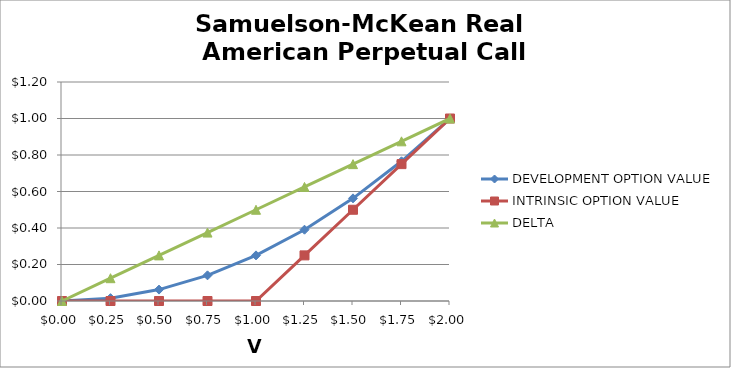
| Category | DEVELOPMENT OPTION VALUE | INTRINSIC OPTION VALUE | DELTA |
|---|---|---|---|
| 0.0 | 0 | 0 | 0 |
| 0.25 | 0.016 | 0 | 0.125 |
| 0.5 | 0.062 | 0 | 0.25 |
| 0.75 | 0.141 | 0 | 0.375 |
| 1.0 | 0.25 | 0 | 0.5 |
| 1.25 | 0.391 | 0.25 | 0.625 |
| 1.5 | 0.562 | 0.5 | 0.75 |
| 1.75 | 0.766 | 0.75 | 0.875 |
| 2.0 | 1 | 1 | 1 |